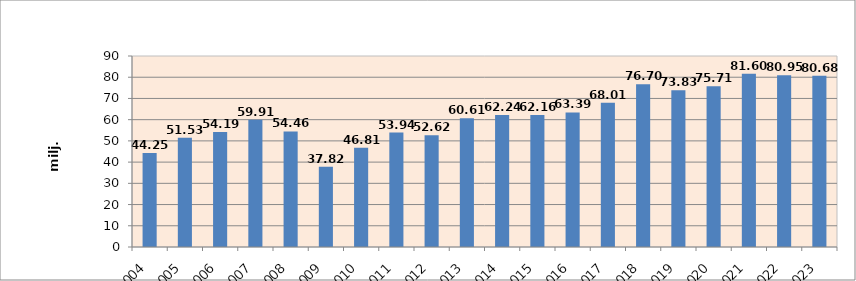
| Category | Series 0 |
|---|---|
| 2004.0 | 44.25 |
| 2005.0 | 51.53 |
| 2006.0 | 54.19 |
| 2007.0 | 59.91 |
| 2008.0 | 54.46 |
| 2009.0 | 37.82 |
| 2010.0 | 46.81 |
| 2011.0 | 53.94 |
| 2012.0 | 52.62 |
| 2013.0 | 60.61 |
| 2014.0 | 62.24 |
| 2015.0 | 62.16 |
| 2016.0 | 63.388 |
| 2017.0 | 68.01 |
| 2018.0 | 76.7 |
| 2019.0 | 73.83 |
| 2020.0 | 75.71 |
| 2021.0 | 81.6 |
| 2022.0 | 80.948 |
| 2023.0 | 80.68 |